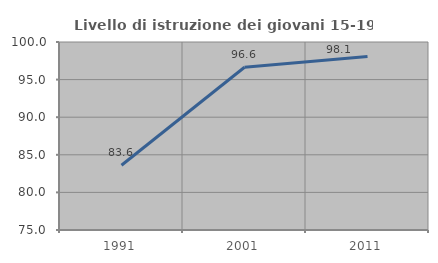
| Category | Livello di istruzione dei giovani 15-19 anni |
|---|---|
| 1991.0 | 83.607 |
| 2001.0 | 96.644 |
| 2011.0 | 98.065 |